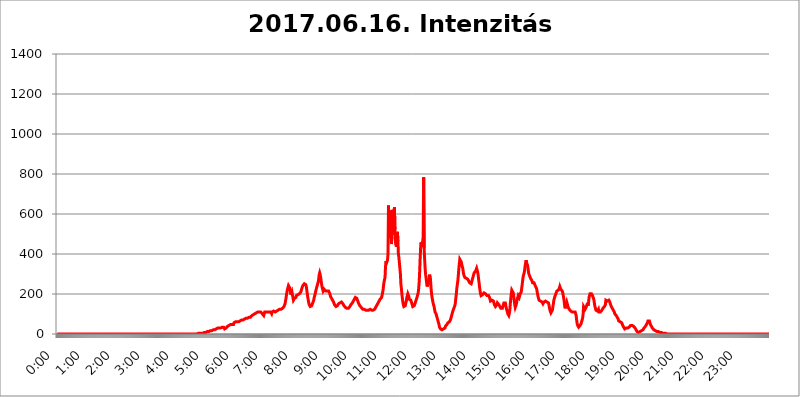
| Category | 2017.06.16. Intenzitás [W/m^2] |
|---|---|
| 0.0 | 0 |
| 0.0006944444444444445 | 0 |
| 0.001388888888888889 | 0 |
| 0.0020833333333333333 | 0 |
| 0.002777777777777778 | 0 |
| 0.003472222222222222 | 0 |
| 0.004166666666666667 | 0 |
| 0.004861111111111111 | 0 |
| 0.005555555555555556 | 0 |
| 0.0062499999999999995 | 0 |
| 0.006944444444444444 | 0 |
| 0.007638888888888889 | 0 |
| 0.008333333333333333 | 0 |
| 0.009027777777777779 | 0 |
| 0.009722222222222222 | 0 |
| 0.010416666666666666 | 0 |
| 0.011111111111111112 | 0 |
| 0.011805555555555555 | 0 |
| 0.012499999999999999 | 0 |
| 0.013194444444444444 | 0 |
| 0.013888888888888888 | 0 |
| 0.014583333333333332 | 0 |
| 0.015277777777777777 | 0 |
| 0.015972222222222224 | 0 |
| 0.016666666666666666 | 0 |
| 0.017361111111111112 | 0 |
| 0.018055555555555557 | 0 |
| 0.01875 | 0 |
| 0.019444444444444445 | 0 |
| 0.02013888888888889 | 0 |
| 0.020833333333333332 | 0 |
| 0.02152777777777778 | 0 |
| 0.022222222222222223 | 0 |
| 0.02291666666666667 | 0 |
| 0.02361111111111111 | 0 |
| 0.024305555555555556 | 0 |
| 0.024999999999999998 | 0 |
| 0.025694444444444447 | 0 |
| 0.02638888888888889 | 0 |
| 0.027083333333333334 | 0 |
| 0.027777777777777776 | 0 |
| 0.02847222222222222 | 0 |
| 0.029166666666666664 | 0 |
| 0.029861111111111113 | 0 |
| 0.030555555555555555 | 0 |
| 0.03125 | 0 |
| 0.03194444444444445 | 0 |
| 0.03263888888888889 | 0 |
| 0.03333333333333333 | 0 |
| 0.034027777777777775 | 0 |
| 0.034722222222222224 | 0 |
| 0.035416666666666666 | 0 |
| 0.036111111111111115 | 0 |
| 0.03680555555555556 | 0 |
| 0.0375 | 0 |
| 0.03819444444444444 | 0 |
| 0.03888888888888889 | 0 |
| 0.03958333333333333 | 0 |
| 0.04027777777777778 | 0 |
| 0.04097222222222222 | 0 |
| 0.041666666666666664 | 0 |
| 0.042361111111111106 | 0 |
| 0.04305555555555556 | 0 |
| 0.043750000000000004 | 0 |
| 0.044444444444444446 | 0 |
| 0.04513888888888889 | 0 |
| 0.04583333333333334 | 0 |
| 0.04652777777777778 | 0 |
| 0.04722222222222222 | 0 |
| 0.04791666666666666 | 0 |
| 0.04861111111111111 | 0 |
| 0.049305555555555554 | 0 |
| 0.049999999999999996 | 0 |
| 0.05069444444444445 | 0 |
| 0.051388888888888894 | 0 |
| 0.052083333333333336 | 0 |
| 0.05277777777777778 | 0 |
| 0.05347222222222222 | 0 |
| 0.05416666666666667 | 0 |
| 0.05486111111111111 | 0 |
| 0.05555555555555555 | 0 |
| 0.05625 | 0 |
| 0.05694444444444444 | 0 |
| 0.057638888888888885 | 0 |
| 0.05833333333333333 | 0 |
| 0.05902777777777778 | 0 |
| 0.059722222222222225 | 0 |
| 0.06041666666666667 | 0 |
| 0.061111111111111116 | 0 |
| 0.06180555555555556 | 0 |
| 0.0625 | 0 |
| 0.06319444444444444 | 0 |
| 0.06388888888888888 | 0 |
| 0.06458333333333334 | 0 |
| 0.06527777777777778 | 0 |
| 0.06597222222222222 | 0 |
| 0.06666666666666667 | 0 |
| 0.06736111111111111 | 0 |
| 0.06805555555555555 | 0 |
| 0.06874999999999999 | 0 |
| 0.06944444444444443 | 0 |
| 0.07013888888888889 | 0 |
| 0.07083333333333333 | 0 |
| 0.07152777777777779 | 0 |
| 0.07222222222222223 | 0 |
| 0.07291666666666667 | 0 |
| 0.07361111111111111 | 0 |
| 0.07430555555555556 | 0 |
| 0.075 | 0 |
| 0.07569444444444444 | 0 |
| 0.0763888888888889 | 0 |
| 0.07708333333333334 | 0 |
| 0.07777777777777778 | 0 |
| 0.07847222222222222 | 0 |
| 0.07916666666666666 | 0 |
| 0.0798611111111111 | 0 |
| 0.08055555555555556 | 0 |
| 0.08125 | 0 |
| 0.08194444444444444 | 0 |
| 0.08263888888888889 | 0 |
| 0.08333333333333333 | 0 |
| 0.08402777777777777 | 0 |
| 0.08472222222222221 | 0 |
| 0.08541666666666665 | 0 |
| 0.08611111111111112 | 0 |
| 0.08680555555555557 | 0 |
| 0.08750000000000001 | 0 |
| 0.08819444444444445 | 0 |
| 0.08888888888888889 | 0 |
| 0.08958333333333333 | 0 |
| 0.09027777777777778 | 0 |
| 0.09097222222222222 | 0 |
| 0.09166666666666667 | 0 |
| 0.09236111111111112 | 0 |
| 0.09305555555555556 | 0 |
| 0.09375 | 0 |
| 0.09444444444444444 | 0 |
| 0.09513888888888888 | 0 |
| 0.09583333333333333 | 0 |
| 0.09652777777777777 | 0 |
| 0.09722222222222222 | 0 |
| 0.09791666666666667 | 0 |
| 0.09861111111111111 | 0 |
| 0.09930555555555555 | 0 |
| 0.09999999999999999 | 0 |
| 0.10069444444444443 | 0 |
| 0.1013888888888889 | 0 |
| 0.10208333333333335 | 0 |
| 0.10277777777777779 | 0 |
| 0.10347222222222223 | 0 |
| 0.10416666666666667 | 0 |
| 0.10486111111111111 | 0 |
| 0.10555555555555556 | 0 |
| 0.10625 | 0 |
| 0.10694444444444444 | 0 |
| 0.1076388888888889 | 0 |
| 0.10833333333333334 | 0 |
| 0.10902777777777778 | 0 |
| 0.10972222222222222 | 0 |
| 0.1111111111111111 | 0 |
| 0.11180555555555556 | 0 |
| 0.11180555555555556 | 0 |
| 0.1125 | 0 |
| 0.11319444444444444 | 0 |
| 0.11388888888888889 | 0 |
| 0.11458333333333333 | 0 |
| 0.11527777777777777 | 0 |
| 0.11597222222222221 | 0 |
| 0.11666666666666665 | 0 |
| 0.1173611111111111 | 0 |
| 0.11805555555555557 | 0 |
| 0.11944444444444445 | 0 |
| 0.12013888888888889 | 0 |
| 0.12083333333333333 | 0 |
| 0.12152777777777778 | 0 |
| 0.12222222222222223 | 0 |
| 0.12291666666666667 | 0 |
| 0.12291666666666667 | 0 |
| 0.12361111111111112 | 0 |
| 0.12430555555555556 | 0 |
| 0.125 | 0 |
| 0.12569444444444444 | 0 |
| 0.12638888888888888 | 0 |
| 0.12708333333333333 | 0 |
| 0.16875 | 0 |
| 0.12847222222222224 | 0 |
| 0.12916666666666668 | 0 |
| 0.12986111111111112 | 0 |
| 0.13055555555555556 | 0 |
| 0.13125 | 0 |
| 0.13194444444444445 | 0 |
| 0.1326388888888889 | 0 |
| 0.13333333333333333 | 0 |
| 0.13402777777777777 | 0 |
| 0.13402777777777777 | 0 |
| 0.13472222222222222 | 0 |
| 0.13541666666666666 | 0 |
| 0.1361111111111111 | 0 |
| 0.13749999999999998 | 0 |
| 0.13819444444444443 | 0 |
| 0.1388888888888889 | 0 |
| 0.13958333333333334 | 0 |
| 0.14027777777777778 | 0 |
| 0.14097222222222222 | 0 |
| 0.14166666666666666 | 0 |
| 0.1423611111111111 | 0 |
| 0.14305555555555557 | 0 |
| 0.14375000000000002 | 0 |
| 0.14444444444444446 | 0 |
| 0.1451388888888889 | 0 |
| 0.1451388888888889 | 0 |
| 0.14652777777777778 | 0 |
| 0.14722222222222223 | 0 |
| 0.14791666666666667 | 0 |
| 0.1486111111111111 | 0 |
| 0.14930555555555555 | 0 |
| 0.15 | 0 |
| 0.15069444444444444 | 0 |
| 0.15138888888888888 | 0 |
| 0.15208333333333332 | 0 |
| 0.15277777777777776 | 0 |
| 0.15347222222222223 | 0 |
| 0.15416666666666667 | 0 |
| 0.15486111111111112 | 0 |
| 0.15555555555555556 | 0 |
| 0.15625 | 0 |
| 0.15694444444444444 | 0 |
| 0.15763888888888888 | 0 |
| 0.15833333333333333 | 0 |
| 0.15902777777777777 | 0 |
| 0.15972222222222224 | 0 |
| 0.16041666666666668 | 0 |
| 0.16111111111111112 | 0 |
| 0.16180555555555556 | 0 |
| 0.1625 | 0 |
| 0.16319444444444445 | 0 |
| 0.1638888888888889 | 0 |
| 0.16458333333333333 | 0 |
| 0.16527777777777777 | 0 |
| 0.16597222222222222 | 0 |
| 0.16666666666666666 | 0 |
| 0.1673611111111111 | 0 |
| 0.16805555555555554 | 0 |
| 0.16874999999999998 | 0 |
| 0.16944444444444443 | 0 |
| 0.17013888888888887 | 0 |
| 0.1708333333333333 | 0 |
| 0.17152777777777775 | 0 |
| 0.17222222222222225 | 0 |
| 0.1729166666666667 | 0 |
| 0.17361111111111113 | 0 |
| 0.17430555555555557 | 0 |
| 0.17500000000000002 | 0 |
| 0.17569444444444446 | 0 |
| 0.1763888888888889 | 0 |
| 0.17708333333333334 | 0 |
| 0.17777777777777778 | 0 |
| 0.17847222222222223 | 0 |
| 0.17916666666666667 | 0 |
| 0.1798611111111111 | 0 |
| 0.18055555555555555 | 0 |
| 0.18125 | 0 |
| 0.18194444444444444 | 0 |
| 0.1826388888888889 | 0 |
| 0.18333333333333335 | 0 |
| 0.1840277777777778 | 0 |
| 0.18472222222222223 | 0 |
| 0.18541666666666667 | 0 |
| 0.18611111111111112 | 0 |
| 0.18680555555555556 | 0 |
| 0.1875 | 0 |
| 0.18819444444444444 | 0 |
| 0.18888888888888888 | 0 |
| 0.18958333333333333 | 0 |
| 0.19027777777777777 | 0 |
| 0.1909722222222222 | 0 |
| 0.19166666666666665 | 0 |
| 0.19236111111111112 | 0 |
| 0.19305555555555554 | 0 |
| 0.19375 | 0 |
| 0.19444444444444445 | 0 |
| 0.1951388888888889 | 0 |
| 0.19583333333333333 | 0 |
| 0.19652777777777777 | 0 |
| 0.19722222222222222 | 0 |
| 0.19791666666666666 | 3.525 |
| 0.1986111111111111 | 3.525 |
| 0.19930555555555554 | 3.525 |
| 0.19999999999999998 | 3.525 |
| 0.20069444444444443 | 3.525 |
| 0.20138888888888887 | 3.525 |
| 0.2020833333333333 | 3.525 |
| 0.2027777777777778 | 3.525 |
| 0.2034722222222222 | 3.525 |
| 0.2041666666666667 | 3.525 |
| 0.20486111111111113 | 3.525 |
| 0.20555555555555557 | 7.887 |
| 0.20625000000000002 | 7.887 |
| 0.20694444444444446 | 7.887 |
| 0.2076388888888889 | 7.887 |
| 0.20833333333333334 | 7.887 |
| 0.20902777777777778 | 12.257 |
| 0.20972222222222223 | 12.257 |
| 0.21041666666666667 | 12.257 |
| 0.2111111111111111 | 12.257 |
| 0.21180555555555555 | 12.257 |
| 0.2125 | 12.257 |
| 0.21319444444444444 | 12.257 |
| 0.2138888888888889 | 16.636 |
| 0.21458333333333335 | 16.636 |
| 0.2152777777777778 | 16.636 |
| 0.21597222222222223 | 16.636 |
| 0.21666666666666667 | 16.636 |
| 0.21736111111111112 | 21.024 |
| 0.21805555555555556 | 21.024 |
| 0.21875 | 21.024 |
| 0.21944444444444444 | 21.024 |
| 0.22013888888888888 | 21.024 |
| 0.22083333333333333 | 21.024 |
| 0.22152777777777777 | 21.024 |
| 0.2222222222222222 | 21.024 |
| 0.22291666666666665 | 25.419 |
| 0.2236111111111111 | 25.419 |
| 0.22430555555555556 | 25.419 |
| 0.225 | 29.823 |
| 0.22569444444444445 | 29.823 |
| 0.2263888888888889 | 29.823 |
| 0.22708333333333333 | 29.823 |
| 0.22777777777777777 | 29.823 |
| 0.22847222222222222 | 29.823 |
| 0.22916666666666666 | 29.823 |
| 0.2298611111111111 | 29.823 |
| 0.23055555555555554 | 34.234 |
| 0.23124999999999998 | 34.234 |
| 0.23194444444444443 | 34.234 |
| 0.23263888888888887 | 34.234 |
| 0.2333333333333333 | 34.234 |
| 0.2340277777777778 | 29.823 |
| 0.2347222222222222 | 25.419 |
| 0.2354166666666667 | 29.823 |
| 0.23611111111111113 | 29.823 |
| 0.23680555555555557 | 29.823 |
| 0.23750000000000002 | 29.823 |
| 0.23819444444444446 | 34.234 |
| 0.2388888888888889 | 38.653 |
| 0.23958333333333334 | 43.079 |
| 0.24027777777777778 | 43.079 |
| 0.24097222222222223 | 43.079 |
| 0.24166666666666667 | 43.079 |
| 0.2423611111111111 | 47.511 |
| 0.24305555555555555 | 47.511 |
| 0.24375 | 47.511 |
| 0.24444444444444446 | 47.511 |
| 0.24513888888888888 | 47.511 |
| 0.24583333333333335 | 43.079 |
| 0.2465277777777778 | 47.511 |
| 0.24722222222222223 | 47.511 |
| 0.24791666666666667 | 56.398 |
| 0.24861111111111112 | 56.398 |
| 0.24930555555555556 | 56.398 |
| 0.25 | 60.85 |
| 0.25069444444444444 | 60.85 |
| 0.2513888888888889 | 60.85 |
| 0.2520833333333333 | 60.85 |
| 0.25277777777777777 | 60.85 |
| 0.2534722222222222 | 60.85 |
| 0.25416666666666665 | 60.85 |
| 0.2548611111111111 | 60.85 |
| 0.2555555555555556 | 65.31 |
| 0.25625000000000003 | 65.31 |
| 0.2569444444444445 | 65.31 |
| 0.2576388888888889 | 65.31 |
| 0.25833333333333336 | 69.775 |
| 0.2590277777777778 | 69.775 |
| 0.25972222222222224 | 69.775 |
| 0.2604166666666667 | 69.775 |
| 0.2611111111111111 | 69.775 |
| 0.26180555555555557 | 74.246 |
| 0.2625 | 74.246 |
| 0.26319444444444445 | 74.246 |
| 0.2638888888888889 | 74.246 |
| 0.26458333333333334 | 78.722 |
| 0.2652777777777778 | 78.722 |
| 0.2659722222222222 | 78.722 |
| 0.26666666666666666 | 78.722 |
| 0.2673611111111111 | 83.205 |
| 0.26805555555555555 | 83.205 |
| 0.26875 | 83.205 |
| 0.26944444444444443 | 83.205 |
| 0.2701388888888889 | 83.205 |
| 0.2708333333333333 | 83.205 |
| 0.27152777777777776 | 87.692 |
| 0.2722222222222222 | 87.692 |
| 0.27291666666666664 | 92.184 |
| 0.2736111111111111 | 92.184 |
| 0.2743055555555555 | 92.184 |
| 0.27499999999999997 | 96.682 |
| 0.27569444444444446 | 96.682 |
| 0.27638888888888885 | 101.184 |
| 0.27708333333333335 | 101.184 |
| 0.2777777777777778 | 101.184 |
| 0.27847222222222223 | 101.184 |
| 0.2791666666666667 | 105.69 |
| 0.2798611111111111 | 105.69 |
| 0.28055555555555556 | 105.69 |
| 0.28125 | 110.201 |
| 0.28194444444444444 | 110.201 |
| 0.2826388888888889 | 110.201 |
| 0.2833333333333333 | 110.201 |
| 0.28402777777777777 | 110.201 |
| 0.2847222222222222 | 110.201 |
| 0.28541666666666665 | 110.201 |
| 0.28611111111111115 | 110.201 |
| 0.28680555555555554 | 110.201 |
| 0.28750000000000003 | 101.184 |
| 0.2881944444444445 | 105.69 |
| 0.2888888888888889 | 96.682 |
| 0.28958333333333336 | 92.184 |
| 0.2902777777777778 | 101.184 |
| 0.29097222222222224 | 110.201 |
| 0.2916666666666667 | 110.201 |
| 0.2923611111111111 | 110.201 |
| 0.29305555555555557 | 110.201 |
| 0.29375 | 110.201 |
| 0.29444444444444445 | 110.201 |
| 0.2951388888888889 | 110.201 |
| 0.29583333333333334 | 110.201 |
| 0.2965277777777778 | 110.201 |
| 0.2972222222222222 | 110.201 |
| 0.29791666666666666 | 110.201 |
| 0.2986111111111111 | 105.69 |
| 0.29930555555555555 | 110.201 |
| 0.3 | 110.201 |
| 0.30069444444444443 | 101.184 |
| 0.3013888888888889 | 110.201 |
| 0.3020833333333333 | 110.201 |
| 0.30277777777777776 | 110.201 |
| 0.3034722222222222 | 114.716 |
| 0.30416666666666664 | 110.201 |
| 0.3048611111111111 | 110.201 |
| 0.3055555555555555 | 110.201 |
| 0.30624999999999997 | 110.201 |
| 0.3069444444444444 | 110.201 |
| 0.3076388888888889 | 114.716 |
| 0.30833333333333335 | 114.716 |
| 0.3090277777777778 | 119.235 |
| 0.30972222222222223 | 119.235 |
| 0.3104166666666667 | 119.235 |
| 0.3111111111111111 | 119.235 |
| 0.31180555555555556 | 123.758 |
| 0.3125 | 123.758 |
| 0.31319444444444444 | 123.758 |
| 0.3138888888888889 | 123.758 |
| 0.3145833333333333 | 128.284 |
| 0.31527777777777777 | 128.284 |
| 0.3159722222222222 | 128.284 |
| 0.31666666666666665 | 128.284 |
| 0.31736111111111115 | 132.814 |
| 0.31805555555555554 | 137.347 |
| 0.31875000000000003 | 141.884 |
| 0.3194444444444445 | 150.964 |
| 0.3201388888888889 | 164.605 |
| 0.32083333333333336 | 178.264 |
| 0.3215277777777778 | 196.497 |
| 0.32222222222222224 | 210.182 |
| 0.3229166666666667 | 223.873 |
| 0.3236111111111111 | 233 |
| 0.32430555555555557 | 242.127 |
| 0.325 | 242.127 |
| 0.32569444444444445 | 242.127 |
| 0.3263888888888889 | 228.436 |
| 0.32708333333333334 | 233 |
| 0.3277777777777778 | 196.497 |
| 0.3284722222222222 | 201.058 |
| 0.32916666666666666 | 210.182 |
| 0.3298611111111111 | 196.497 |
| 0.33055555555555555 | 182.82 |
| 0.33125 | 169.156 |
| 0.33194444444444443 | 169.156 |
| 0.3326388888888889 | 178.264 |
| 0.3333333333333333 | 173.709 |
| 0.3340277777777778 | 182.82 |
| 0.3347222222222222 | 182.82 |
| 0.3354166666666667 | 191.937 |
| 0.3361111111111111 | 191.937 |
| 0.3368055555555556 | 191.937 |
| 0.33749999999999997 | 196.497 |
| 0.33819444444444446 | 196.497 |
| 0.33888888888888885 | 196.497 |
| 0.33958333333333335 | 201.058 |
| 0.34027777777777773 | 201.058 |
| 0.34097222222222223 | 205.62 |
| 0.3416666666666666 | 210.182 |
| 0.3423611111111111 | 219.309 |
| 0.3430555555555555 | 228.436 |
| 0.34375 | 233 |
| 0.3444444444444445 | 242.127 |
| 0.3451388888888889 | 242.127 |
| 0.3458333333333334 | 242.127 |
| 0.34652777777777777 | 251.251 |
| 0.34722222222222227 | 251.251 |
| 0.34791666666666665 | 255.813 |
| 0.34861111111111115 | 246.689 |
| 0.34930555555555554 | 237.564 |
| 0.35000000000000003 | 219.309 |
| 0.3506944444444444 | 201.058 |
| 0.3513888888888889 | 182.82 |
| 0.3520833333333333 | 169.156 |
| 0.3527777777777778 | 155.509 |
| 0.3534722222222222 | 146.423 |
| 0.3541666666666667 | 141.884 |
| 0.3548611111111111 | 137.347 |
| 0.35555555555555557 | 137.347 |
| 0.35625 | 137.347 |
| 0.35694444444444445 | 141.884 |
| 0.3576388888888889 | 146.423 |
| 0.35833333333333334 | 155.509 |
| 0.3590277777777778 | 160.056 |
| 0.3597222222222222 | 169.156 |
| 0.36041666666666666 | 182.82 |
| 0.3611111111111111 | 191.937 |
| 0.36180555555555555 | 201.058 |
| 0.3625 | 214.746 |
| 0.36319444444444443 | 223.873 |
| 0.3638888888888889 | 233 |
| 0.3645833333333333 | 242.127 |
| 0.3652777777777778 | 251.251 |
| 0.3659722222222222 | 260.373 |
| 0.3666666666666667 | 274.047 |
| 0.3673611111111111 | 296.808 |
| 0.3680555555555556 | 305.898 |
| 0.36874999999999997 | 296.808 |
| 0.36944444444444446 | 283.156 |
| 0.37013888888888885 | 264.932 |
| 0.37083333333333335 | 246.689 |
| 0.37152777777777773 | 233 |
| 0.37222222222222223 | 228.436 |
| 0.3729166666666666 | 214.746 |
| 0.3736111111111111 | 219.309 |
| 0.3743055555555555 | 223.873 |
| 0.375 | 219.309 |
| 0.3756944444444445 | 219.309 |
| 0.3763888888888889 | 214.746 |
| 0.3770833333333334 | 214.746 |
| 0.37777777777777777 | 219.309 |
| 0.37847222222222227 | 214.746 |
| 0.37916666666666665 | 210.182 |
| 0.37986111111111115 | 214.746 |
| 0.38055555555555554 | 214.746 |
| 0.38125000000000003 | 210.182 |
| 0.3819444444444444 | 205.62 |
| 0.3826388888888889 | 201.058 |
| 0.3833333333333333 | 187.378 |
| 0.3840277777777778 | 182.82 |
| 0.3847222222222222 | 178.264 |
| 0.3854166666666667 | 173.709 |
| 0.3861111111111111 | 169.156 |
| 0.38680555555555557 | 164.605 |
| 0.3875 | 160.056 |
| 0.38819444444444445 | 155.509 |
| 0.3888888888888889 | 146.423 |
| 0.38958333333333334 | 146.423 |
| 0.3902777777777778 | 141.884 |
| 0.3909722222222222 | 137.347 |
| 0.39166666666666666 | 137.347 |
| 0.3923611111111111 | 137.347 |
| 0.39305555555555555 | 141.884 |
| 0.39375 | 146.423 |
| 0.39444444444444443 | 150.964 |
| 0.3951388888888889 | 150.964 |
| 0.3958333333333333 | 155.509 |
| 0.3965277777777778 | 155.509 |
| 0.3972222222222222 | 160.056 |
| 0.3979166666666667 | 160.056 |
| 0.3986111111111111 | 160.056 |
| 0.3993055555555556 | 155.509 |
| 0.39999999999999997 | 155.509 |
| 0.40069444444444446 | 150.964 |
| 0.40138888888888885 | 146.423 |
| 0.40208333333333335 | 141.884 |
| 0.40277777777777773 | 137.347 |
| 0.40347222222222223 | 137.347 |
| 0.4041666666666666 | 132.814 |
| 0.4048611111111111 | 128.284 |
| 0.4055555555555555 | 128.284 |
| 0.40625 | 128.284 |
| 0.4069444444444445 | 128.284 |
| 0.4076388888888889 | 128.284 |
| 0.4083333333333334 | 128.284 |
| 0.40902777777777777 | 128.284 |
| 0.40972222222222227 | 132.814 |
| 0.41041666666666665 | 137.347 |
| 0.41111111111111115 | 137.347 |
| 0.41180555555555554 | 146.423 |
| 0.41250000000000003 | 146.423 |
| 0.4131944444444444 | 150.964 |
| 0.4138888888888889 | 155.509 |
| 0.4145833333333333 | 160.056 |
| 0.4152777777777778 | 164.605 |
| 0.4159722222222222 | 169.156 |
| 0.4166666666666667 | 173.709 |
| 0.4173611111111111 | 178.264 |
| 0.41805555555555557 | 182.82 |
| 0.41875 | 187.378 |
| 0.41944444444444445 | 182.82 |
| 0.4201388888888889 | 178.264 |
| 0.42083333333333334 | 173.709 |
| 0.4215277777777778 | 164.605 |
| 0.4222222222222222 | 160.056 |
| 0.42291666666666666 | 150.964 |
| 0.4236111111111111 | 146.423 |
| 0.42430555555555555 | 141.884 |
| 0.425 | 137.347 |
| 0.42569444444444443 | 137.347 |
| 0.4263888888888889 | 132.814 |
| 0.4270833333333333 | 128.284 |
| 0.4277777777777778 | 128.284 |
| 0.4284722222222222 | 123.758 |
| 0.4291666666666667 | 123.758 |
| 0.4298611111111111 | 119.235 |
| 0.4305555555555556 | 123.758 |
| 0.43124999999999997 | 119.235 |
| 0.43194444444444446 | 123.758 |
| 0.43263888888888885 | 119.235 |
| 0.43333333333333335 | 119.235 |
| 0.43402777777777773 | 119.235 |
| 0.43472222222222223 | 119.235 |
| 0.4354166666666666 | 119.235 |
| 0.4361111111111111 | 119.235 |
| 0.4368055555555555 | 119.235 |
| 0.4375 | 119.235 |
| 0.4381944444444445 | 119.235 |
| 0.4388888888888889 | 123.758 |
| 0.4395833333333334 | 119.235 |
| 0.44027777777777777 | 119.235 |
| 0.44097222222222227 | 119.235 |
| 0.44166666666666665 | 119.235 |
| 0.44236111111111115 | 119.235 |
| 0.44305555555555554 | 119.235 |
| 0.44375000000000003 | 119.235 |
| 0.4444444444444444 | 119.235 |
| 0.4451388888888889 | 123.758 |
| 0.4458333333333333 | 128.284 |
| 0.4465277777777778 | 132.814 |
| 0.4472222222222222 | 137.347 |
| 0.4479166666666667 | 137.347 |
| 0.4486111111111111 | 146.423 |
| 0.44930555555555557 | 150.964 |
| 0.45 | 155.509 |
| 0.45069444444444445 | 160.056 |
| 0.4513888888888889 | 164.605 |
| 0.45208333333333334 | 169.156 |
| 0.4527777777777778 | 173.709 |
| 0.4534722222222222 | 173.709 |
| 0.45416666666666666 | 178.264 |
| 0.4548611111111111 | 182.82 |
| 0.45555555555555555 | 191.937 |
| 0.45625 | 205.62 |
| 0.45694444444444443 | 219.309 |
| 0.4576388888888889 | 242.127 |
| 0.4583333333333333 | 260.373 |
| 0.4590277777777778 | 264.932 |
| 0.4597222222222222 | 283.156 |
| 0.4604166666666667 | 337.639 |
| 0.4611111111111111 | 364.728 |
| 0.4618055555555556 | 355.712 |
| 0.46249999999999997 | 360.221 |
| 0.46319444444444446 | 369.23 |
| 0.46388888888888885 | 400.638 |
| 0.46458333333333335 | 642.4 |
| 0.46527777777777773 | 480.356 |
| 0.46597222222222223 | 558.261 |
| 0.4666666666666666 | 506.542 |
| 0.4673611111111111 | 617.436 |
| 0.4680555555555555 | 489.108 |
| 0.46875 | 449.551 |
| 0.4694444444444445 | 523.88 |
| 0.4701388888888889 | 532.513 |
| 0.4708333333333334 | 621.613 |
| 0.47152777777777777 | 497.836 |
| 0.47222222222222227 | 592.233 |
| 0.47291666666666665 | 634.105 |
| 0.47361111111111115 | 523.88 |
| 0.47430555555555554 | 458.38 |
| 0.47500000000000003 | 445.129 |
| 0.4756944444444444 | 436.27 |
| 0.4763888888888889 | 484.735 |
| 0.4770833333333333 | 510.885 |
| 0.4777777777777778 | 467.187 |
| 0.4784722222222222 | 400.638 |
| 0.4791666666666667 | 382.715 |
| 0.4798611111111111 | 355.712 |
| 0.48055555555555557 | 328.584 |
| 0.48125 | 301.354 |
| 0.48194444444444445 | 251.251 |
| 0.4826388888888889 | 228.436 |
| 0.48333333333333334 | 201.058 |
| 0.4840277777777778 | 178.264 |
| 0.4847222222222222 | 160.056 |
| 0.48541666666666666 | 146.423 |
| 0.4861111111111111 | 137.347 |
| 0.48680555555555555 | 137.347 |
| 0.4875 | 137.347 |
| 0.48819444444444443 | 141.884 |
| 0.4888888888888889 | 155.509 |
| 0.4895833333333333 | 164.605 |
| 0.4902777777777778 | 182.82 |
| 0.4909722222222222 | 191.937 |
| 0.4916666666666667 | 201.058 |
| 0.4923611111111111 | 201.058 |
| 0.4930555555555556 | 187.378 |
| 0.49374999999999997 | 173.709 |
| 0.49444444444444446 | 173.709 |
| 0.49513888888888885 | 169.156 |
| 0.49583333333333335 | 169.156 |
| 0.49652777777777773 | 173.709 |
| 0.49722222222222223 | 164.605 |
| 0.4979166666666666 | 146.423 |
| 0.4986111111111111 | 137.347 |
| 0.4993055555555555 | 132.814 |
| 0.5 | 132.814 |
| 0.5006944444444444 | 141.884 |
| 0.5013888888888889 | 146.423 |
| 0.5020833333333333 | 155.509 |
| 0.5027777777777778 | 164.605 |
| 0.5034722222222222 | 169.156 |
| 0.5041666666666667 | 178.264 |
| 0.5048611111111111 | 187.378 |
| 0.5055555555555555 | 196.497 |
| 0.50625 | 205.62 |
| 0.5069444444444444 | 228.436 |
| 0.5076388888888889 | 260.373 |
| 0.5083333333333333 | 314.98 |
| 0.5090277777777777 | 382.715 |
| 0.5097222222222222 | 436.27 |
| 0.5104166666666666 | 458.38 |
| 0.5111111111111112 | 436.27 |
| 0.5118055555555555 | 440.702 |
| 0.5125000000000001 | 462.786 |
| 0.5131944444444444 | 484.735 |
| 0.513888888888889 | 783.342 |
| 0.5145833333333333 | 427.39 |
| 0.5152777777777778 | 373.729 |
| 0.5159722222222222 | 328.584 |
| 0.5166666666666667 | 296.808 |
| 0.517361111111111 | 278.603 |
| 0.5180555555555556 | 255.813 |
| 0.5187499999999999 | 237.564 |
| 0.5194444444444445 | 237.564 |
| 0.5201388888888888 | 251.251 |
| 0.5208333333333334 | 264.932 |
| 0.5215277777777778 | 278.603 |
| 0.5222222222222223 | 296.808 |
| 0.5229166666666667 | 296.808 |
| 0.5236111111111111 | 264.932 |
| 0.5243055555555556 | 228.436 |
| 0.525 | 201.058 |
| 0.5256944444444445 | 182.82 |
| 0.5263888888888889 | 169.156 |
| 0.5270833333333333 | 155.509 |
| 0.5277777777777778 | 146.423 |
| 0.5284722222222222 | 137.347 |
| 0.5291666666666667 | 123.758 |
| 0.5298611111111111 | 110.201 |
| 0.5305555555555556 | 105.69 |
| 0.53125 | 101.184 |
| 0.5319444444444444 | 92.184 |
| 0.5326388888888889 | 83.205 |
| 0.5333333333333333 | 74.246 |
| 0.5340277777777778 | 65.31 |
| 0.5347222222222222 | 56.398 |
| 0.5354166666666667 | 47.511 |
| 0.5361111111111111 | 34.234 |
| 0.5368055555555555 | 29.823 |
| 0.5375 | 25.419 |
| 0.5381944444444444 | 25.419 |
| 0.5388888888888889 | 21.024 |
| 0.5395833333333333 | 21.024 |
| 0.5402777777777777 | 21.024 |
| 0.5409722222222222 | 25.419 |
| 0.5416666666666666 | 25.419 |
| 0.5423611111111112 | 29.823 |
| 0.5430555555555555 | 29.823 |
| 0.5437500000000001 | 29.823 |
| 0.5444444444444444 | 38.653 |
| 0.545138888888889 | 38.653 |
| 0.5458333333333333 | 43.079 |
| 0.5465277777777778 | 47.511 |
| 0.5472222222222222 | 51.951 |
| 0.5479166666666667 | 56.398 |
| 0.548611111111111 | 56.398 |
| 0.5493055555555556 | 60.85 |
| 0.5499999999999999 | 60.85 |
| 0.5506944444444445 | 65.31 |
| 0.5513888888888888 | 69.775 |
| 0.5520833333333334 | 78.722 |
| 0.5527777777777778 | 87.692 |
| 0.5534722222222223 | 96.682 |
| 0.5541666666666667 | 105.69 |
| 0.5548611111111111 | 114.716 |
| 0.5555555555555556 | 119.235 |
| 0.55625 | 128.284 |
| 0.5569444444444445 | 132.814 |
| 0.5576388888888889 | 141.884 |
| 0.5583333333333333 | 155.509 |
| 0.5590277777777778 | 178.264 |
| 0.5597222222222222 | 201.058 |
| 0.5604166666666667 | 228.436 |
| 0.5611111111111111 | 246.689 |
| 0.5618055555555556 | 264.932 |
| 0.5625 | 292.259 |
| 0.5631944444444444 | 324.052 |
| 0.5638888888888889 | 351.198 |
| 0.5645833333333333 | 373.729 |
| 0.5652777777777778 | 378.224 |
| 0.5659722222222222 | 369.23 |
| 0.5666666666666667 | 360.221 |
| 0.5673611111111111 | 346.682 |
| 0.5680555555555555 | 337.639 |
| 0.56875 | 328.584 |
| 0.5694444444444444 | 310.44 |
| 0.5701388888888889 | 296.808 |
| 0.5708333333333333 | 292.259 |
| 0.5715277777777777 | 283.156 |
| 0.5722222222222222 | 278.603 |
| 0.5729166666666666 | 278.603 |
| 0.5736111111111112 | 278.603 |
| 0.5743055555555555 | 274.047 |
| 0.5750000000000001 | 274.047 |
| 0.5756944444444444 | 274.047 |
| 0.576388888888889 | 269.49 |
| 0.5770833333333333 | 264.932 |
| 0.5777777777777778 | 260.373 |
| 0.5784722222222222 | 255.813 |
| 0.5791666666666667 | 255.813 |
| 0.579861111111111 | 251.251 |
| 0.5805555555555556 | 251.251 |
| 0.5812499999999999 | 260.373 |
| 0.5819444444444445 | 264.932 |
| 0.5826388888888888 | 278.603 |
| 0.5833333333333334 | 287.709 |
| 0.5840277777777778 | 296.808 |
| 0.5847222222222223 | 305.898 |
| 0.5854166666666667 | 310.44 |
| 0.5861111111111111 | 310.44 |
| 0.5868055555555556 | 314.98 |
| 0.5875 | 310.44 |
| 0.5881944444444445 | 328.584 |
| 0.5888888888888889 | 324.052 |
| 0.5895833333333333 | 310.44 |
| 0.5902777777777778 | 296.808 |
| 0.5909722222222222 | 274.047 |
| 0.5916666666666667 | 255.813 |
| 0.5923611111111111 | 233 |
| 0.5930555555555556 | 214.746 |
| 0.59375 | 201.058 |
| 0.5944444444444444 | 191.937 |
| 0.5951388888888889 | 191.937 |
| 0.5958333333333333 | 191.937 |
| 0.5965277777777778 | 196.497 |
| 0.5972222222222222 | 201.058 |
| 0.5979166666666667 | 201.058 |
| 0.5986111111111111 | 205.62 |
| 0.5993055555555555 | 205.62 |
| 0.6 | 201.058 |
| 0.6006944444444444 | 201.058 |
| 0.6013888888888889 | 196.497 |
| 0.6020833333333333 | 196.497 |
| 0.6027777777777777 | 191.937 |
| 0.6034722222222222 | 191.937 |
| 0.6041666666666666 | 191.937 |
| 0.6048611111111112 | 191.937 |
| 0.6055555555555555 | 191.937 |
| 0.6062500000000001 | 182.82 |
| 0.6069444444444444 | 173.709 |
| 0.607638888888889 | 164.605 |
| 0.6083333333333333 | 160.056 |
| 0.6090277777777778 | 164.605 |
| 0.6097222222222222 | 169.156 |
| 0.6104166666666667 | 173.709 |
| 0.611111111111111 | 169.156 |
| 0.6118055555555556 | 164.605 |
| 0.6124999999999999 | 155.509 |
| 0.6131944444444445 | 146.423 |
| 0.6138888888888888 | 141.884 |
| 0.6145833333333334 | 137.347 |
| 0.6152777777777778 | 141.884 |
| 0.6159722222222223 | 141.884 |
| 0.6166666666666667 | 146.423 |
| 0.6173611111111111 | 155.509 |
| 0.6180555555555556 | 155.509 |
| 0.61875 | 150.964 |
| 0.6194444444444445 | 146.423 |
| 0.6201388888888889 | 141.884 |
| 0.6208333333333333 | 137.347 |
| 0.6215277777777778 | 132.814 |
| 0.6222222222222222 | 128.284 |
| 0.6229166666666667 | 128.284 |
| 0.6236111111111111 | 128.284 |
| 0.6243055555555556 | 128.284 |
| 0.625 | 132.814 |
| 0.6256944444444444 | 146.423 |
| 0.6263888888888889 | 155.509 |
| 0.6270833333333333 | 160.056 |
| 0.6277777777777778 | 155.509 |
| 0.6284722222222222 | 155.509 |
| 0.6291666666666667 | 141.884 |
| 0.6298611111111111 | 128.284 |
| 0.6305555555555555 | 119.235 |
| 0.63125 | 110.201 |
| 0.6319444444444444 | 101.184 |
| 0.6326388888888889 | 96.682 |
| 0.6333333333333333 | 92.184 |
| 0.6340277777777777 | 101.184 |
| 0.6347222222222222 | 119.235 |
| 0.6354166666666666 | 150.964 |
| 0.6361111111111112 | 178.264 |
| 0.6368055555555555 | 201.058 |
| 0.6375000000000001 | 219.309 |
| 0.6381944444444444 | 223.873 |
| 0.638888888888889 | 223.873 |
| 0.6395833333333333 | 205.62 |
| 0.6402777777777778 | 187.378 |
| 0.6409722222222222 | 164.605 |
| 0.6416666666666667 | 146.423 |
| 0.642361111111111 | 132.814 |
| 0.6430555555555556 | 132.814 |
| 0.6437499999999999 | 146.423 |
| 0.6444444444444445 | 160.056 |
| 0.6451388888888888 | 173.709 |
| 0.6458333333333334 | 182.82 |
| 0.6465277777777778 | 191.937 |
| 0.6472222222222223 | 187.378 |
| 0.6479166666666667 | 182.82 |
| 0.6486111111111111 | 191.937 |
| 0.6493055555555556 | 201.058 |
| 0.65 | 205.62 |
| 0.6506944444444445 | 210.182 |
| 0.6513888888888889 | 228.436 |
| 0.6520833333333333 | 246.689 |
| 0.6527777777777778 | 269.49 |
| 0.6534722222222222 | 287.709 |
| 0.6541666666666667 | 296.808 |
| 0.6548611111111111 | 305.898 |
| 0.6555555555555556 | 319.517 |
| 0.65625 | 342.162 |
| 0.6569444444444444 | 346.682 |
| 0.6576388888888889 | 369.23 |
| 0.6583333333333333 | 355.712 |
| 0.6590277777777778 | 351.198 |
| 0.6597222222222222 | 342.162 |
| 0.6604166666666667 | 324.052 |
| 0.6611111111111111 | 305.898 |
| 0.6618055555555555 | 296.808 |
| 0.6625 | 301.354 |
| 0.6631944444444444 | 292.259 |
| 0.6638888888888889 | 278.603 |
| 0.6645833333333333 | 278.603 |
| 0.6652777777777777 | 278.603 |
| 0.6659722222222222 | 264.932 |
| 0.6666666666666666 | 255.813 |
| 0.6673611111111111 | 251.251 |
| 0.6680555555555556 | 260.373 |
| 0.6687500000000001 | 255.813 |
| 0.6694444444444444 | 255.813 |
| 0.6701388888888888 | 251.251 |
| 0.6708333333333334 | 237.564 |
| 0.6715277777777778 | 233 |
| 0.6722222222222222 | 228.436 |
| 0.6729166666666666 | 214.746 |
| 0.6736111111111112 | 201.058 |
| 0.6743055555555556 | 187.378 |
| 0.6749999999999999 | 178.264 |
| 0.6756944444444444 | 169.156 |
| 0.6763888888888889 | 164.605 |
| 0.6770833333333334 | 164.605 |
| 0.6777777777777777 | 164.605 |
| 0.6784722222222223 | 169.156 |
| 0.6791666666666667 | 164.605 |
| 0.6798611111111111 | 160.056 |
| 0.6805555555555555 | 155.509 |
| 0.68125 | 150.964 |
| 0.6819444444444445 | 155.509 |
| 0.6826388888888889 | 160.056 |
| 0.6833333333333332 | 164.605 |
| 0.6840277777777778 | 164.605 |
| 0.6847222222222222 | 164.605 |
| 0.6854166666666667 | 164.605 |
| 0.686111111111111 | 164.605 |
| 0.6868055555555556 | 160.056 |
| 0.6875 | 164.605 |
| 0.6881944444444444 | 160.056 |
| 0.688888888888889 | 155.509 |
| 0.6895833333333333 | 146.423 |
| 0.6902777777777778 | 132.814 |
| 0.6909722222222222 | 119.235 |
| 0.6916666666666668 | 114.716 |
| 0.6923611111111111 | 105.69 |
| 0.6930555555555555 | 101.184 |
| 0.69375 | 110.201 |
| 0.6944444444444445 | 119.235 |
| 0.6951388888888889 | 137.347 |
| 0.6958333333333333 | 150.964 |
| 0.6965277777777777 | 169.156 |
| 0.6972222222222223 | 178.264 |
| 0.6979166666666666 | 187.378 |
| 0.6986111111111111 | 191.937 |
| 0.6993055555555556 | 201.058 |
| 0.7000000000000001 | 205.62 |
| 0.7006944444444444 | 214.746 |
| 0.7013888888888888 | 210.182 |
| 0.7020833333333334 | 214.746 |
| 0.7027777777777778 | 219.309 |
| 0.7034722222222222 | 219.309 |
| 0.7041666666666666 | 228.436 |
| 0.7048611111111112 | 237.564 |
| 0.7055555555555556 | 237.564 |
| 0.7062499999999999 | 223.873 |
| 0.7069444444444444 | 228.436 |
| 0.7076388888888889 | 228.436 |
| 0.7083333333333334 | 214.746 |
| 0.7090277777777777 | 205.62 |
| 0.7097222222222223 | 191.937 |
| 0.7104166666666667 | 178.264 |
| 0.7111111111111111 | 160.056 |
| 0.7118055555555555 | 137.347 |
| 0.7125 | 128.284 |
| 0.7131944444444445 | 132.814 |
| 0.7138888888888889 | 150.964 |
| 0.7145833333333332 | 160.056 |
| 0.7152777777777778 | 150.964 |
| 0.7159722222222222 | 141.884 |
| 0.7166666666666667 | 132.814 |
| 0.717361111111111 | 128.284 |
| 0.7180555555555556 | 123.758 |
| 0.71875 | 119.235 |
| 0.7194444444444444 | 119.235 |
| 0.720138888888889 | 114.716 |
| 0.7208333333333333 | 114.716 |
| 0.7215277777777778 | 110.201 |
| 0.7222222222222222 | 110.201 |
| 0.7229166666666668 | 110.201 |
| 0.7236111111111111 | 110.201 |
| 0.7243055555555555 | 110.201 |
| 0.725 | 110.201 |
| 0.7256944444444445 | 110.201 |
| 0.7263888888888889 | 110.201 |
| 0.7270833333333333 | 110.201 |
| 0.7277777777777777 | 92.184 |
| 0.7284722222222223 | 69.775 |
| 0.7291666666666666 | 51.951 |
| 0.7298611111111111 | 43.079 |
| 0.7305555555555556 | 38.653 |
| 0.7312500000000001 | 34.234 |
| 0.7319444444444444 | 38.653 |
| 0.7326388888888888 | 38.653 |
| 0.7333333333333334 | 43.079 |
| 0.7340277777777778 | 47.511 |
| 0.7347222222222222 | 51.951 |
| 0.7354166666666666 | 60.85 |
| 0.7361111111111112 | 69.775 |
| 0.7368055555555556 | 78.722 |
| 0.7374999999999999 | 96.682 |
| 0.7381944444444444 | 137.347 |
| 0.7388888888888889 | 141.884 |
| 0.7395833333333334 | 132.814 |
| 0.7402777777777777 | 123.758 |
| 0.7409722222222223 | 128.284 |
| 0.7416666666666667 | 132.814 |
| 0.7423611111111111 | 128.284 |
| 0.7430555555555555 | 128.284 |
| 0.74375 | 155.509 |
| 0.7444444444444445 | 141.884 |
| 0.7451388888888889 | 155.509 |
| 0.7458333333333332 | 182.82 |
| 0.7465277777777778 | 182.82 |
| 0.7472222222222222 | 201.058 |
| 0.7479166666666667 | 201.058 |
| 0.748611111111111 | 205.62 |
| 0.7493055555555556 | 201.058 |
| 0.75 | 201.058 |
| 0.7506944444444444 | 191.937 |
| 0.751388888888889 | 187.378 |
| 0.7520833333333333 | 178.264 |
| 0.7527777777777778 | 169.156 |
| 0.7534722222222222 | 150.964 |
| 0.7541666666666668 | 137.347 |
| 0.7548611111111111 | 128.284 |
| 0.7555555555555555 | 119.235 |
| 0.75625 | 114.716 |
| 0.7569444444444445 | 114.716 |
| 0.7576388888888889 | 114.716 |
| 0.7583333333333333 | 114.716 |
| 0.7590277777777777 | 123.758 |
| 0.7597222222222223 | 110.201 |
| 0.7604166666666666 | 110.201 |
| 0.7611111111111111 | 110.201 |
| 0.7618055555555556 | 110.201 |
| 0.7625000000000001 | 110.201 |
| 0.7631944444444444 | 114.716 |
| 0.7638888888888888 | 119.235 |
| 0.7645833333333334 | 123.758 |
| 0.7652777777777778 | 128.284 |
| 0.7659722222222222 | 132.814 |
| 0.7666666666666666 | 132.814 |
| 0.7673611111111112 | 137.347 |
| 0.7680555555555556 | 141.884 |
| 0.7687499999999999 | 146.423 |
| 0.7694444444444444 | 169.156 |
| 0.7701388888888889 | 164.605 |
| 0.7708333333333334 | 164.605 |
| 0.7715277777777777 | 164.605 |
| 0.7722222222222223 | 164.605 |
| 0.7729166666666667 | 164.605 |
| 0.7736111111111111 | 169.156 |
| 0.7743055555555555 | 169.156 |
| 0.775 | 160.056 |
| 0.7756944444444445 | 150.964 |
| 0.7763888888888889 | 146.423 |
| 0.7770833333333332 | 137.347 |
| 0.7777777777777778 | 132.814 |
| 0.7784722222222222 | 128.284 |
| 0.7791666666666667 | 123.758 |
| 0.779861111111111 | 119.235 |
| 0.7805555555555556 | 114.716 |
| 0.78125 | 110.201 |
| 0.7819444444444444 | 101.184 |
| 0.782638888888889 | 101.184 |
| 0.7833333333333333 | 96.682 |
| 0.7840277777777778 | 92.184 |
| 0.7847222222222222 | 87.692 |
| 0.7854166666666668 | 83.205 |
| 0.7861111111111111 | 78.722 |
| 0.7868055555555555 | 74.246 |
| 0.7875 | 65.31 |
| 0.7881944444444445 | 65.31 |
| 0.7888888888888889 | 60.85 |
| 0.7895833333333333 | 60.85 |
| 0.7902777777777777 | 56.398 |
| 0.7909722222222223 | 56.398 |
| 0.7916666666666666 | 56.398 |
| 0.7923611111111111 | 51.951 |
| 0.7930555555555556 | 43.079 |
| 0.7937500000000001 | 38.653 |
| 0.7944444444444444 | 34.234 |
| 0.7951388888888888 | 29.823 |
| 0.7958333333333334 | 25.419 |
| 0.7965277777777778 | 29.823 |
| 0.7972222222222222 | 29.823 |
| 0.7979166666666666 | 29.823 |
| 0.7986111111111112 | 29.823 |
| 0.7993055555555556 | 25.419 |
| 0.7999999999999999 | 29.823 |
| 0.8006944444444444 | 34.234 |
| 0.8013888888888889 | 34.234 |
| 0.8020833333333334 | 34.234 |
| 0.8027777777777777 | 34.234 |
| 0.8034722222222223 | 38.653 |
| 0.8041666666666667 | 43.079 |
| 0.8048611111111111 | 47.511 |
| 0.8055555555555555 | 47.511 |
| 0.80625 | 43.079 |
| 0.8069444444444445 | 43.079 |
| 0.8076388888888889 | 38.653 |
| 0.8083333333333332 | 38.653 |
| 0.8090277777777778 | 34.234 |
| 0.8097222222222222 | 34.234 |
| 0.8104166666666667 | 29.823 |
| 0.811111111111111 | 25.419 |
| 0.8118055555555556 | 21.024 |
| 0.8125 | 16.636 |
| 0.8131944444444444 | 12.257 |
| 0.813888888888889 | 12.257 |
| 0.8145833333333333 | 12.257 |
| 0.8152777777777778 | 7.887 |
| 0.8159722222222222 | 12.257 |
| 0.8166666666666668 | 12.257 |
| 0.8173611111111111 | 12.257 |
| 0.8180555555555555 | 12.257 |
| 0.81875 | 16.636 |
| 0.8194444444444445 | 16.636 |
| 0.8201388888888889 | 21.024 |
| 0.8208333333333333 | 21.024 |
| 0.8215277777777777 | 21.024 |
| 0.8222222222222223 | 25.419 |
| 0.8229166666666666 | 29.823 |
| 0.8236111111111111 | 29.823 |
| 0.8243055555555556 | 34.234 |
| 0.8250000000000001 | 38.653 |
| 0.8256944444444444 | 43.079 |
| 0.8263888888888888 | 47.511 |
| 0.8270833333333334 | 47.511 |
| 0.8277777777777778 | 56.398 |
| 0.8284722222222222 | 65.31 |
| 0.8291666666666666 | 69.775 |
| 0.8298611111111112 | 65.31 |
| 0.8305555555555556 | 65.31 |
| 0.8312499999999999 | 56.398 |
| 0.8319444444444444 | 47.511 |
| 0.8326388888888889 | 43.079 |
| 0.8333333333333334 | 38.653 |
| 0.8340277777777777 | 34.234 |
| 0.8347222222222223 | 29.823 |
| 0.8354166666666667 | 29.823 |
| 0.8361111111111111 | 25.419 |
| 0.8368055555555555 | 21.024 |
| 0.8375 | 21.024 |
| 0.8381944444444445 | 21.024 |
| 0.8388888888888889 | 16.636 |
| 0.8395833333333332 | 16.636 |
| 0.8402777777777778 | 12.257 |
| 0.8409722222222222 | 12.257 |
| 0.8416666666666667 | 12.257 |
| 0.842361111111111 | 12.257 |
| 0.8430555555555556 | 12.257 |
| 0.84375 | 12.257 |
| 0.8444444444444444 | 12.257 |
| 0.845138888888889 | 7.887 |
| 0.8458333333333333 | 7.887 |
| 0.8465277777777778 | 7.887 |
| 0.8472222222222222 | 7.887 |
| 0.8479166666666668 | 3.525 |
| 0.8486111111111111 | 3.525 |
| 0.8493055555555555 | 3.525 |
| 0.85 | 3.525 |
| 0.8506944444444445 | 3.525 |
| 0.8513888888888889 | 3.525 |
| 0.8520833333333333 | 3.525 |
| 0.8527777777777777 | 3.525 |
| 0.8534722222222223 | 3.525 |
| 0.8541666666666666 | 3.525 |
| 0.8548611111111111 | 3.525 |
| 0.8555555555555556 | 0 |
| 0.8562500000000001 | 0 |
| 0.8569444444444444 | 0 |
| 0.8576388888888888 | 0 |
| 0.8583333333333334 | 0 |
| 0.8590277777777778 | 0 |
| 0.8597222222222222 | 0 |
| 0.8604166666666666 | 0 |
| 0.8611111111111112 | 0 |
| 0.8618055555555556 | 0 |
| 0.8624999999999999 | 0 |
| 0.8631944444444444 | 0 |
| 0.8638888888888889 | 0 |
| 0.8645833333333334 | 0 |
| 0.8652777777777777 | 0 |
| 0.8659722222222223 | 0 |
| 0.8666666666666667 | 0 |
| 0.8673611111111111 | 0 |
| 0.8680555555555555 | 0 |
| 0.86875 | 0 |
| 0.8694444444444445 | 0 |
| 0.8701388888888889 | 0 |
| 0.8708333333333332 | 0 |
| 0.8715277777777778 | 0 |
| 0.8722222222222222 | 0 |
| 0.8729166666666667 | 0 |
| 0.873611111111111 | 0 |
| 0.8743055555555556 | 0 |
| 0.875 | 0 |
| 0.8756944444444444 | 0 |
| 0.876388888888889 | 0 |
| 0.8770833333333333 | 0 |
| 0.8777777777777778 | 0 |
| 0.8784722222222222 | 0 |
| 0.8791666666666668 | 0 |
| 0.8798611111111111 | 0 |
| 0.8805555555555555 | 0 |
| 0.88125 | 0 |
| 0.8819444444444445 | 0 |
| 0.8826388888888889 | 0 |
| 0.8833333333333333 | 0 |
| 0.8840277777777777 | 0 |
| 0.8847222222222223 | 0 |
| 0.8854166666666666 | 0 |
| 0.8861111111111111 | 0 |
| 0.8868055555555556 | 0 |
| 0.8875000000000001 | 0 |
| 0.8881944444444444 | 0 |
| 0.8888888888888888 | 0 |
| 0.8895833333333334 | 0 |
| 0.8902777777777778 | 0 |
| 0.8909722222222222 | 0 |
| 0.8916666666666666 | 0 |
| 0.8923611111111112 | 0 |
| 0.8930555555555556 | 0 |
| 0.8937499999999999 | 0 |
| 0.8944444444444444 | 0 |
| 0.8951388888888889 | 0 |
| 0.8958333333333334 | 0 |
| 0.8965277777777777 | 0 |
| 0.8972222222222223 | 0 |
| 0.8979166666666667 | 0 |
| 0.8986111111111111 | 0 |
| 0.8993055555555555 | 0 |
| 0.9 | 0 |
| 0.9006944444444445 | 0 |
| 0.9013888888888889 | 0 |
| 0.9020833333333332 | 0 |
| 0.9027777777777778 | 0 |
| 0.9034722222222222 | 0 |
| 0.9041666666666667 | 0 |
| 0.904861111111111 | 0 |
| 0.9055555555555556 | 0 |
| 0.90625 | 0 |
| 0.9069444444444444 | 0 |
| 0.907638888888889 | 0 |
| 0.9083333333333333 | 0 |
| 0.9090277777777778 | 0 |
| 0.9097222222222222 | 0 |
| 0.9104166666666668 | 0 |
| 0.9111111111111111 | 0 |
| 0.9118055555555555 | 0 |
| 0.9125 | 0 |
| 0.9131944444444445 | 0 |
| 0.9138888888888889 | 0 |
| 0.9145833333333333 | 0 |
| 0.9152777777777777 | 0 |
| 0.9159722222222223 | 0 |
| 0.9166666666666666 | 0 |
| 0.9173611111111111 | 0 |
| 0.9180555555555556 | 0 |
| 0.9187500000000001 | 0 |
| 0.9194444444444444 | 0 |
| 0.9201388888888888 | 0 |
| 0.9208333333333334 | 0 |
| 0.9215277777777778 | 0 |
| 0.9222222222222222 | 0 |
| 0.9229166666666666 | 0 |
| 0.9236111111111112 | 0 |
| 0.9243055555555556 | 0 |
| 0.9249999999999999 | 0 |
| 0.9256944444444444 | 0 |
| 0.9263888888888889 | 0 |
| 0.9270833333333334 | 0 |
| 0.9277777777777777 | 0 |
| 0.9284722222222223 | 0 |
| 0.9291666666666667 | 0 |
| 0.9298611111111111 | 0 |
| 0.9305555555555555 | 0 |
| 0.93125 | 0 |
| 0.9319444444444445 | 0 |
| 0.9326388888888889 | 0 |
| 0.9333333333333332 | 0 |
| 0.9340277777777778 | 0 |
| 0.9347222222222222 | 0 |
| 0.9354166666666667 | 0 |
| 0.936111111111111 | 0 |
| 0.9368055555555556 | 0 |
| 0.9375 | 0 |
| 0.9381944444444444 | 0 |
| 0.938888888888889 | 0 |
| 0.9395833333333333 | 0 |
| 0.9402777777777778 | 0 |
| 0.9409722222222222 | 0 |
| 0.9416666666666668 | 0 |
| 0.9423611111111111 | 0 |
| 0.9430555555555555 | 0 |
| 0.94375 | 0 |
| 0.9444444444444445 | 0 |
| 0.9451388888888889 | 0 |
| 0.9458333333333333 | 0 |
| 0.9465277777777777 | 0 |
| 0.9472222222222223 | 0 |
| 0.9479166666666666 | 0 |
| 0.9486111111111111 | 0 |
| 0.9493055555555556 | 0 |
| 0.9500000000000001 | 0 |
| 0.9506944444444444 | 0 |
| 0.9513888888888888 | 0 |
| 0.9520833333333334 | 0 |
| 0.9527777777777778 | 0 |
| 0.9534722222222222 | 0 |
| 0.9541666666666666 | 0 |
| 0.9548611111111112 | 0 |
| 0.9555555555555556 | 0 |
| 0.9562499999999999 | 0 |
| 0.9569444444444444 | 0 |
| 0.9576388888888889 | 0 |
| 0.9583333333333334 | 0 |
| 0.9590277777777777 | 0 |
| 0.9597222222222223 | 0 |
| 0.9604166666666667 | 0 |
| 0.9611111111111111 | 0 |
| 0.9618055555555555 | 0 |
| 0.9625 | 0 |
| 0.9631944444444445 | 0 |
| 0.9638888888888889 | 0 |
| 0.9645833333333332 | 0 |
| 0.9652777777777778 | 0 |
| 0.9659722222222222 | 0 |
| 0.9666666666666667 | 0 |
| 0.967361111111111 | 0 |
| 0.9680555555555556 | 0 |
| 0.96875 | 0 |
| 0.9694444444444444 | 0 |
| 0.970138888888889 | 0 |
| 0.9708333333333333 | 0 |
| 0.9715277777777778 | 0 |
| 0.9722222222222222 | 0 |
| 0.9729166666666668 | 0 |
| 0.9736111111111111 | 0 |
| 0.9743055555555555 | 0 |
| 0.975 | 0 |
| 0.9756944444444445 | 0 |
| 0.9763888888888889 | 0 |
| 0.9770833333333333 | 0 |
| 0.9777777777777777 | 0 |
| 0.9784722222222223 | 0 |
| 0.9791666666666666 | 0 |
| 0.9798611111111111 | 0 |
| 0.9805555555555556 | 0 |
| 0.9812500000000001 | 0 |
| 0.9819444444444444 | 0 |
| 0.9826388888888888 | 0 |
| 0.9833333333333334 | 0 |
| 0.9840277777777778 | 0 |
| 0.9847222222222222 | 0 |
| 0.9854166666666666 | 0 |
| 0.9861111111111112 | 0 |
| 0.9868055555555556 | 0 |
| 0.9874999999999999 | 0 |
| 0.9881944444444444 | 0 |
| 0.9888888888888889 | 0 |
| 0.9895833333333334 | 0 |
| 0.9902777777777777 | 0 |
| 0.9909722222222223 | 0 |
| 0.9916666666666667 | 0 |
| 0.9923611111111111 | 0 |
| 0.9930555555555555 | 0 |
| 0.99375 | 0 |
| 0.9944444444444445 | 0 |
| 0.9951388888888889 | 0 |
| 0.9958333333333332 | 0 |
| 0.9965277777777778 | 0 |
| 0.9972222222222222 | 0 |
| 0.9979166666666667 | 0 |
| 0.998611111111111 | 0 |
| 0.9993055555555556 | 0 |